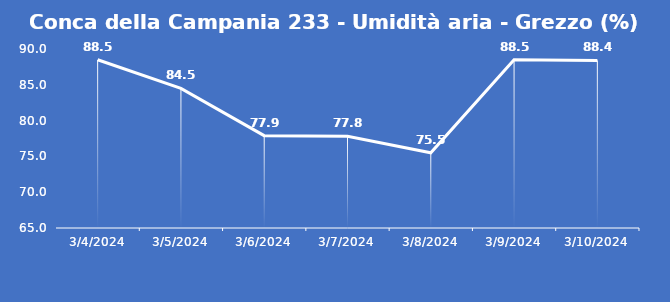
| Category | Conca della Campania 233 - Umidità aria - Grezzo (%) |
|---|---|
| 3/4/24 | 88.5 |
| 3/5/24 | 84.5 |
| 3/6/24 | 77.9 |
| 3/7/24 | 77.8 |
| 3/8/24 | 75.5 |
| 3/9/24 | 88.5 |
| 3/10/24 | 88.4 |